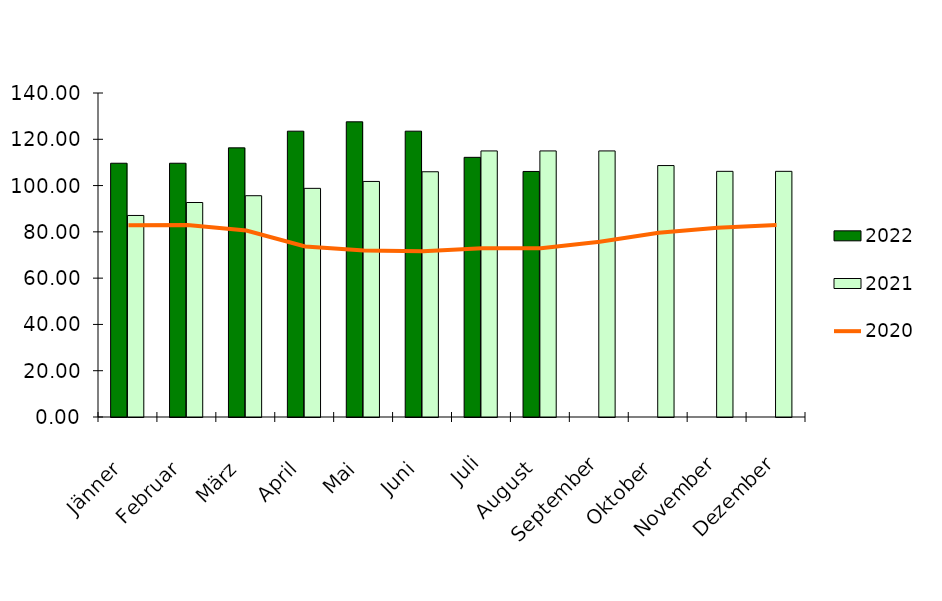
| Category | 2022 | 2021 |
|---|---|---|
| Jänner | 109.65 | 87.083 |
| Februar | 109.65 | 92.683 |
| März | 116.3 | 95.617 |
| April | 123.5 | 98.8 |
| Mai | 127.55 | 101.783 |
| Juni | 123.5 | 105.967 |
| Juli | 112.2 | 114.967 |
| August | 106.1 | 114.967 |
| September | 0 | 114.967 |
| Oktober | 0 | 108.65 |
| November | 0 | 106.15 |
| Dezember | 0 | 106.15 |